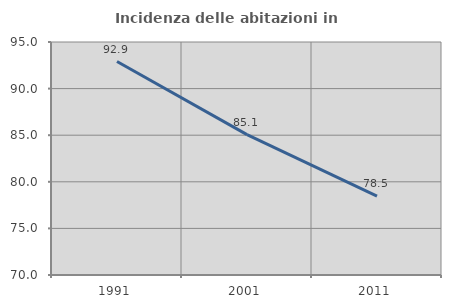
| Category | Incidenza delle abitazioni in proprietà  |
|---|---|
| 1991.0 | 92.903 |
| 2001.0 | 85.065 |
| 2011.0 | 78.472 |